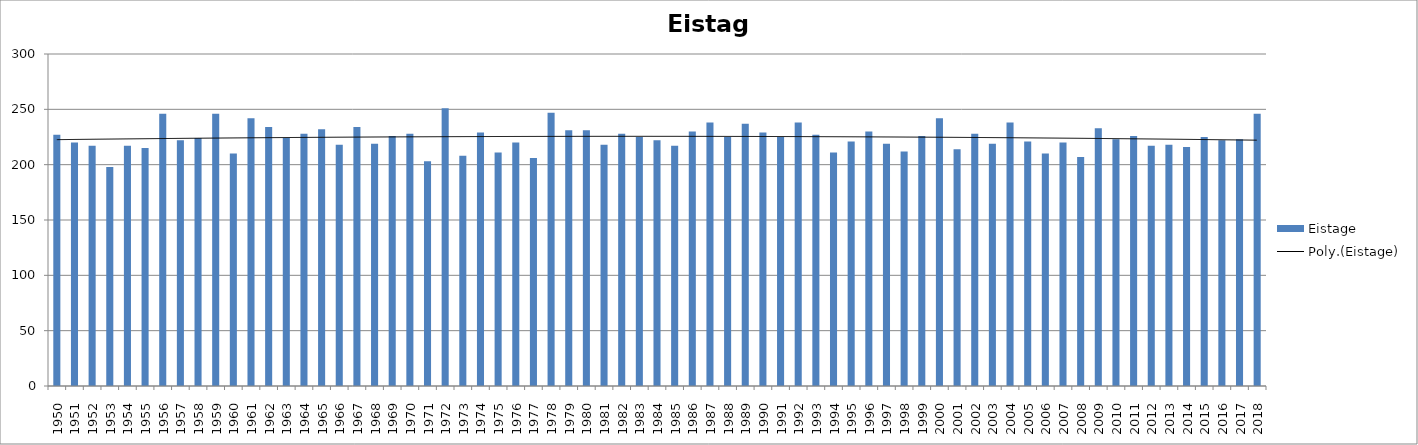
| Category | Eistage |
|---|---|
| 1950.0 | 227 |
| 1951.0 | 220 |
| 1952.0 | 217 |
| 1953.0 | 198 |
| 1954.0 | 217 |
| 1955.0 | 215 |
| 1956.0 | 246 |
| 1957.0 | 222 |
| 1958.0 | 224 |
| 1959.0 | 246 |
| 1960.0 | 210 |
| 1961.0 | 242 |
| 1962.0 | 234 |
| 1963.0 | 224 |
| 1964.0 | 228 |
| 1965.0 | 232 |
| 1966.0 | 218 |
| 1967.0 | 234 |
| 1968.0 | 219 |
| 1969.0 | 226 |
| 1970.0 | 228 |
| 1971.0 | 203 |
| 1972.0 | 251 |
| 1973.0 | 208 |
| 1974.0 | 229 |
| 1975.0 | 211 |
| 1976.0 | 220 |
| 1977.0 | 206 |
| 1978.0 | 247 |
| 1979.0 | 231 |
| 1980.0 | 231 |
| 1981.0 | 218 |
| 1982.0 | 228 |
| 1983.0 | 225 |
| 1984.0 | 222 |
| 1985.0 | 217 |
| 1986.0 | 230 |
| 1987.0 | 238 |
| 1988.0 | 225 |
| 1989.0 | 237 |
| 1990.0 | 229 |
| 1991.0 | 225 |
| 1992.0 | 238 |
| 1993.0 | 227 |
| 1994.0 | 211 |
| 1995.0 | 221 |
| 1996.0 | 230 |
| 1997.0 | 219 |
| 1998.0 | 212 |
| 1999.0 | 226 |
| 2000.0 | 242 |
| 2001.0 | 214 |
| 2002.0 | 228 |
| 2003.0 | 219 |
| 2004.0 | 238 |
| 2005.0 | 221 |
| 2006.0 | 210 |
| 2007.0 | 220 |
| 2008.0 | 207 |
| 2009.0 | 233 |
| 2010.0 | 223 |
| 2011.0 | 226 |
| 2012.0 | 217 |
| 2013.0 | 218 |
| 2014.0 | 216 |
| 2015.0 | 225 |
| 2016.0 | 222 |
| 2017.0 | 223 |
| 2018.0 | 246 |